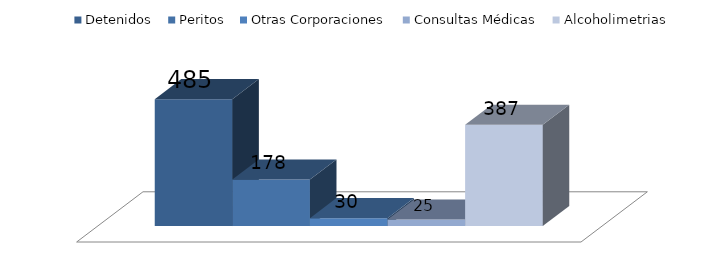
| Category | Detenidos | Peritos | Otras Corporaciones | Consultas Médicas | Alcoholimetrias |
|---|---|---|---|---|---|
| 0 | 485 | 178 | 30 | 25 | 387 |